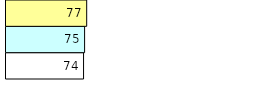
| Category | Total Standouts | Total Recd | Total Tipsters |
|---|---|---|---|
| 0 | 74 | 75 | 77 |